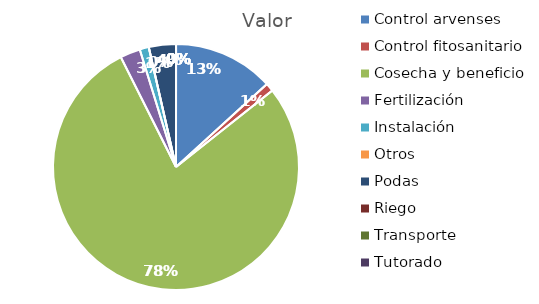
| Category | Valor |
|---|---|
| Control arvenses | 17941125 |
| Control fitosanitario | 1483133 |
| Cosecha y beneficio | 106177500 |
| Fertilización | 3588225 |
| Instalación | 1626662 |
| Otros | 0 |
| Podas | 4832143 |
| Riego | 0 |
| Transporte | 0 |
| Tutorado | 0 |